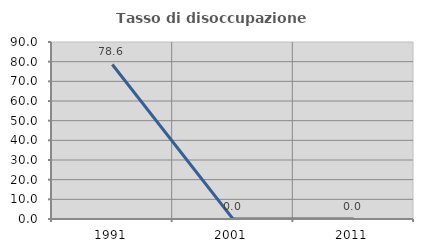
| Category | Tasso di disoccupazione giovanile  |
|---|---|
| 1991.0 | 78.571 |
| 2001.0 | 0 |
| 2011.0 | 0 |